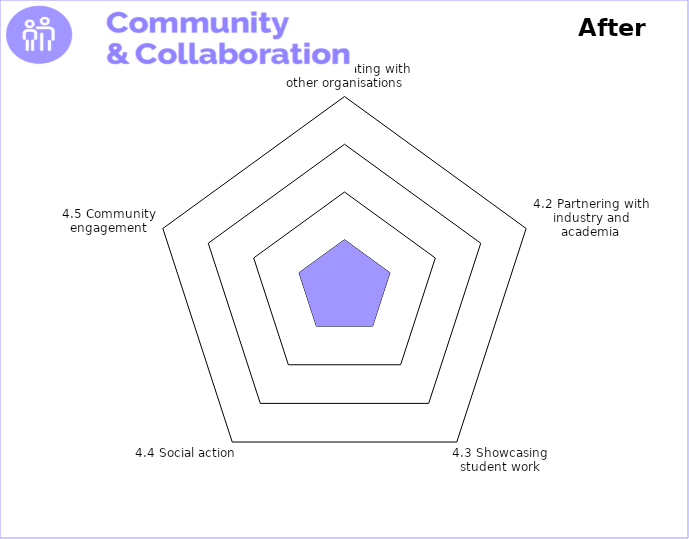
| Category | Theme 1: Leadership, Vision & Culture 

After |
|---|---|
| 4.1 Collaborating with other organisations | 1 |
| 4.2 Partnering with industry and academia | 1 |
| 4.3 Showcasing student work | 1 |
| 4.4 Social action | 1 |
| 4.5 Community engagement | 1 |